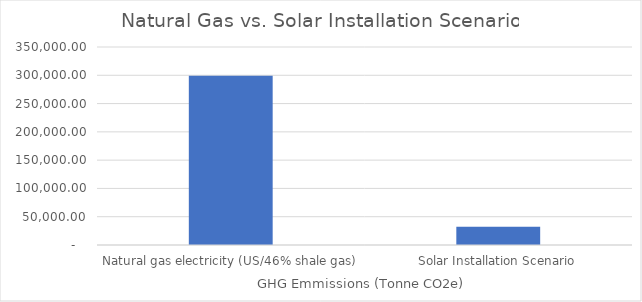
| Category | Series 0 |
|---|---|
| Natural gas electricity (US/46% shale gas) | 299155.428 |
| Solar Installation Scenario | 32151.031 |